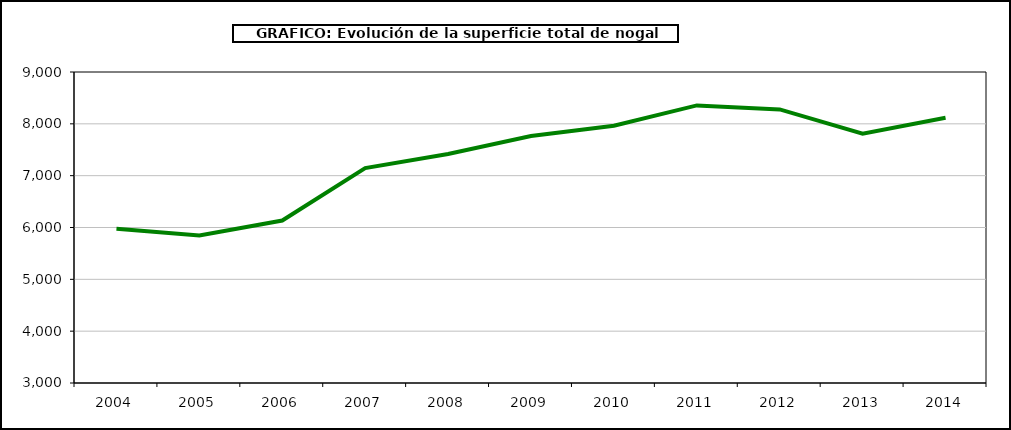
| Category | superficie nogal |
|---|---|
| 2004.0 | 5978 |
| 2005.0 | 5846 |
| 2006.0 | 6134 |
| 2007.0 | 7147 |
| 2008.0 | 7418 |
| 2009.0 | 7765 |
| 2010.0 | 7962 |
| 2011.0 | 8355 |
| 2012.0 | 8278 |
| 2013.0 | 7811 |
| 2014.0 | 8116 |